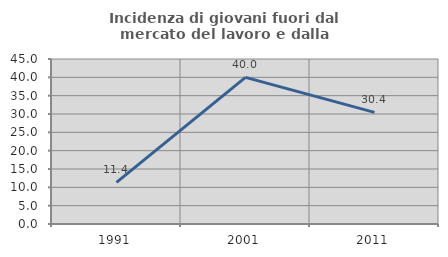
| Category | Incidenza di giovani fuori dal mercato del lavoro e dalla formazione  |
|---|---|
| 1991.0 | 11.364 |
| 2001.0 | 40 |
| 2011.0 | 30.435 |